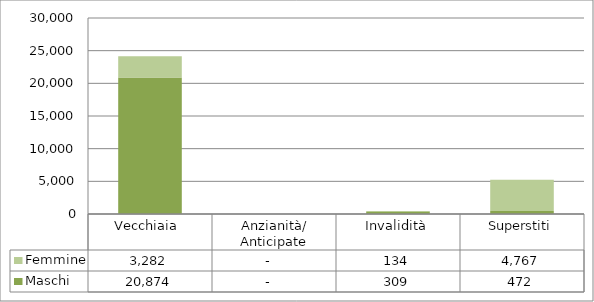
| Category | Maschi | Femmine |
|---|---|---|
| Vecchiaia  | 20874 | 3282 |
| Anzianità/ Anticipate | 0 | 0 |
| Invalidità | 309 | 134 |
| Superstiti | 472 | 4767 |